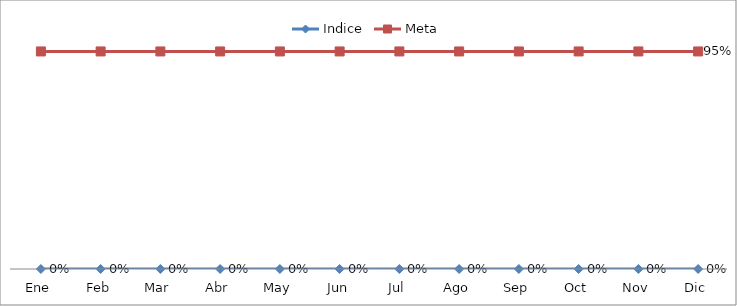
| Category | Indice | Meta |
|---|---|---|
| Ene | 0 | 0.95 |
| Feb | 0 | 0.95 |
| Mar | 0 | 0.95 |
| Abr | 0 | 0.95 |
| May | 0 | 0.95 |
| Jun | 0 | 0.95 |
| Jul | 0 | 0.95 |
| Ago | 0 | 0.95 |
| Sep | 0 | 0.95 |
| Oct | 0 | 0.95 |
| Nov | 0 | 0.95 |
| Dic | 0 | 0.95 |